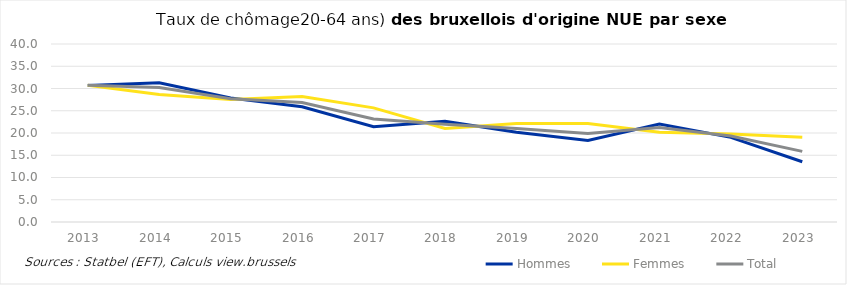
| Category | Hommes | Femmes | Total |
|---|---|---|---|
| 2013.0 | 30.695 | 30.728 | 30.709 |
| 2014.0 | 31.29 | 28.645 | 30.24 |
| 2015.0 | 27.853 | 27.519 | 27.717 |
| 2016.0 | 25.904 | 28.221 | 26.85 |
| 2017.0 | 21.418 | 25.648 | 23.155 |
| 2018.0 | 22.64 | 21.013 | 21.976 |
| 2019.0 | 20.182 | 22.155 | 20.999 |
| 2020.0 | 18.298 | 22.131 | 19.897 |
| 2021.0 | 22.03 | 20.187 | 21.248 |
| 2022.0 | 19.014 | 19.764 | 19.34 |
| 2023.0 | 13.53 | 19.056 | 15.873 |